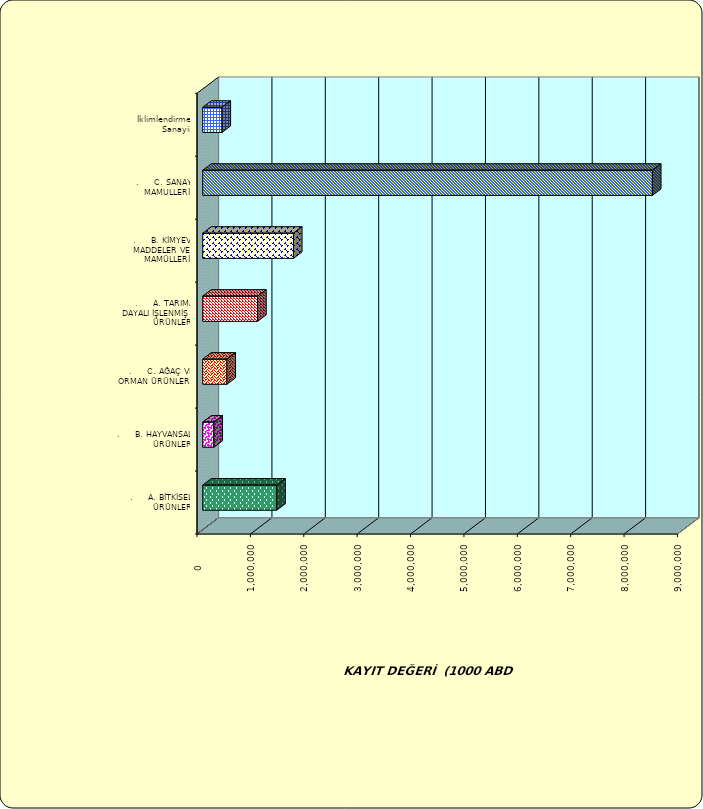
| Category | Series 0 |
|---|---|
| .     A. BİTKİSEL ÜRÜNLER | 1386748.91 |
| .     B. HAYVANSAL ÜRÜNLER | 209750.454 |
| .     C. AĞAÇ VE ORMAN ÜRÜNLERİ | 453783.843 |
| .     A. TARIMA DAYALI İŞLENMİŞ ÜRÜNLER | 1028798.237 |
| .     B. KİMYEVİ MADDELER VE MAMÜLLERİ | 1700258.175 |
| .     C. SANAYİ MAMULLERİ | 8424226.676 |
|  İklimlendirme Sanayii | 361395.47 |